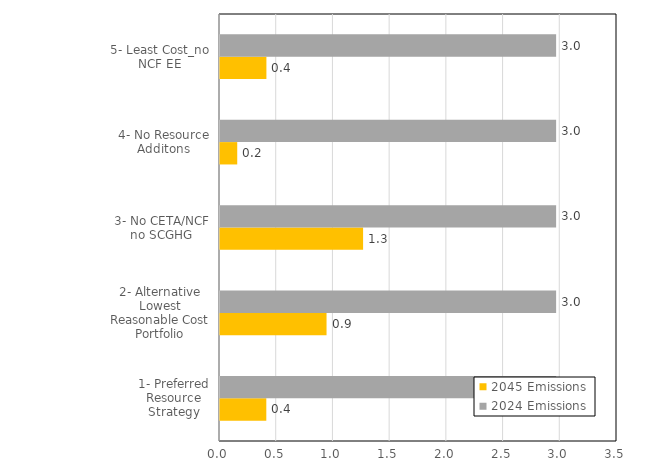
| Category | 2045 Emissions | 2024 Emissions |
|---|---|---|
| 1- Preferred Resource Strategy | 0.408 | 2.963 |
| 2- Alternative Lowest Reasonable Cost Portfolio | 0.939 | 2.963 |
| 3- No CETA/NCF no SCGHG | 1.262 | 2.963 |
| 4- No Resource Additons | 0.152 | 2.963 |
| 5- Least Cost_no NCF EE | 0.409 | 2.963 |